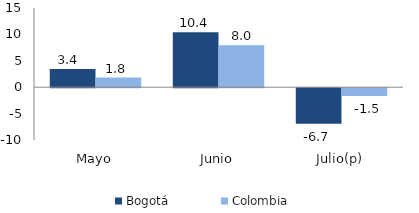
| Category | Bogotá | Colombia |
|---|---|---|
| Mayo | 3.446 | 1.821 |
| Junio | 10.398 | 7.952 |
| Julio(p) | -6.71 | -1.472 |